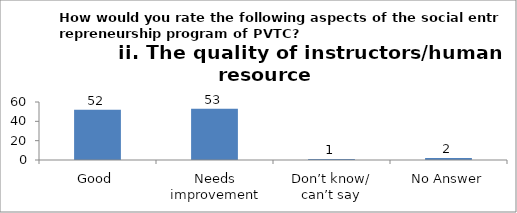
| Category | How would you rate the following aspects of the Social Entrepreneurship program of PVTC? ii. The quality of instructors/human resource  |
|---|---|
| Good | 52 |
| Needs improvement | 53 |
| Don’t know/ can’t say | 1 |
| No Answer | 2 |